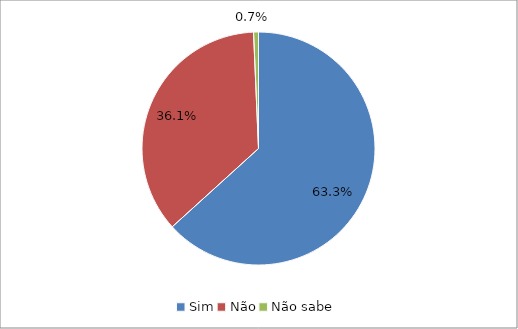
| Category | Series 0 |
|---|---|
| Sim | 0.633 |
| Não | 0.361 |
| Não sabe | 0.007 |